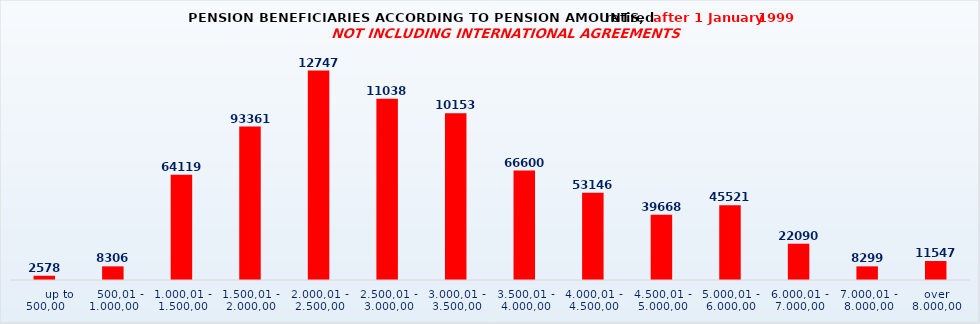
| Category | Series 0 |
|---|---|
|       up to 500,00 | 2578 |
|    500,01 - 1.000,00 | 8306 |
| 1.000,01 - 1.500,00 | 64119 |
| 1.500,01 - 2.000,00 | 93361 |
| 2.000,01 - 2.500,00 | 127472 |
| 2.500,01 - 3.000,00 | 110388 |
| 3.000,01 - 3.500,00 | 101534 |
| 3.500,01 - 4.000,00 | 66600 |
| 4.000,01 - 4.500,00 | 53146 |
| 4.500,01 - 5.000,00 | 39668 |
| 5.000,01 - 6.000,00 | 45521 |
| 6.000,01 - 7.000,00 | 22090 |
| 7.000,01 - 8.000,00 | 8299 |
| over 8.000,00 | 11547 |